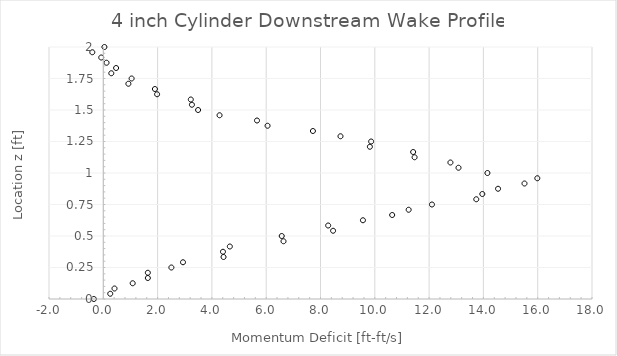
| Category | Series 0 |
|---|---|
| -0.3471909331665657 | 0 |
| 0.25581444588153346 | 0.042 |
| 0.4124193050804337 | 0.083 |
| 1.0826337006213649 | 0.125 |
| 1.6403540014565863 | 0.167 |
| 1.6403540014565863 | 0.208 |
| 2.507386270938234 | 0.25 |
| 2.9356082529200123 | 0.292 |
| 4.4288438540124275 | 0.333 |
| 4.407829803036513 | 0.375 |
| 4.660525069973097 | 0.417 |
| 6.6375952627682935 | 0.458 |
| 6.571971636982532 | 0.5 |
| 8.463654463927917 | 0.542 |
| 8.28266397362676 | 0.583 |
| 9.563234595137871 | 0.625 |
| 10.639978916033435 | 0.667 |
| 11.247114030594766 | 0.708 |
| 12.105154961960665 | 0.75 |
| 13.737618734492848 | 0.792 |
| 13.960330230782262 | 0.833 |
| 14.539861653831146 | 0.875 |
| 15.513771954548261 | 0.917 |
| 15.986249507944002 | 0.958 |
| 14.148447647968467 | 1 |
| 13.083293950845238 | 1.042 |
| 12.785497903929183 | 1.083 |
| 11.465616673255468 | 1.125 |
| 11.412701794795083 | 1.167 |
| 9.81861505862517 | 1.208 |
| 9.8651876335256 | 1.25 |
| 8.736338313222916 | 1.292 |
| 7.721107119360433 | 1.333 |
| 6.049856180788922 | 1.375 |
| 5.661561757544234 | 1.417 |
| 4.281911931162824 | 1.458 |
| 3.4909473916719946 | 1.5 |
| 3.2640419437422494 | 1.542 |
| 3.2228838335876233 | 1.583 |
| 1.9815855062713084 | 1.625 |
| 1.9011154359070161 | 1.667 |
| 0.9242521324821098 | 1.708 |
| 1.0429984203063043 | 1.75 |
| 0.2949271509355711 | 1.792 |
| 0.4712523426346493 | 1.833 |
| 0.11912116401513373 | 1.875 |
| -0.07561542118510545 | 1.917 |
| -0.40522683463186837 | 1.958 |
| 0.041150633158459016 | 2 |